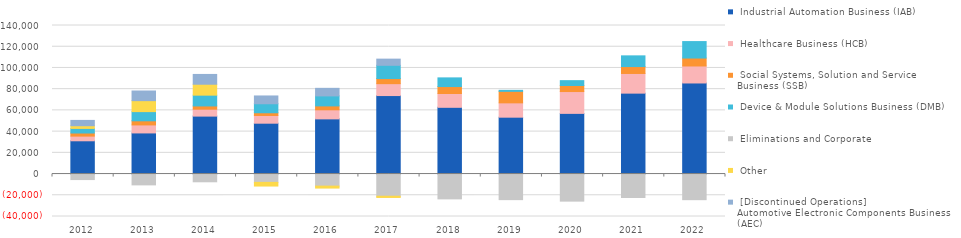
| Category |  Industrial Automation Business (IAB) |  Healthcare Business (HCB) |  Social Systems, Solution and Service Business (SSB) |  Device & Module Solutions Business (DMB) |  Eliminations and Corporate |  Other |  [Discontinued Operations] 
Automotive Electronic Components Business (AEC) |
|---|---|---|---|---|---|---|---|
| 2012.0 | 31349 | 4407 | 2915 | 4351 | -5214 | 2526 | 5009 |
| 2013.0 | 38755 | 7545 | 3880 | 8655 | -10212 | 10348 | 9084 |
| 2014.0 | 54617 | 6511 | 3054 | 10168 | -7294 | 10305 | 9230 |
| 2015.0 | 47929 | 7285 | 2542 | 8494 | -7842 | -3463 | 7342 |
| 2016.0 | 52005 | 8535 | 3685 | 9428 | -11362 | -1852 | 7127 |
| 2017.0 | 73980 | 11211 | 4823 | 12474 | -20892 | -1158 | 5816 |
| 2018.0 | 62895 | 13033 | 6542 | 8165 | -23381 | 0 | 0 |
| 2019.0 | 53595 | 13511 | 10853 | 918 | -24117 | 0 | 0 |
| 2020.0 | 57182 | 20573 | 5693 | 4573 | -25523 | 0 | 0 |
| 2021.0 | 76257 | 18544 | 6505 | 10086 | -22076 | 0 | 0 |
| 2022.0 | 85835 | 16018 | 7490 | 15501 | -24158 | 0 | 0 |